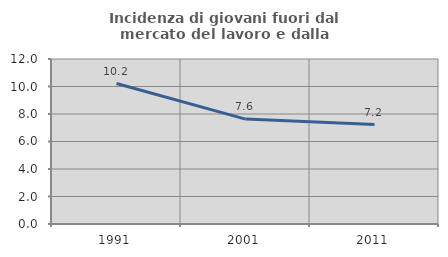
| Category | Incidenza di giovani fuori dal mercato del lavoro e dalla formazione  |
|---|---|
| 1991.0 | 10.215 |
| 2001.0 | 7.628 |
| 2011.0 | 7.235 |